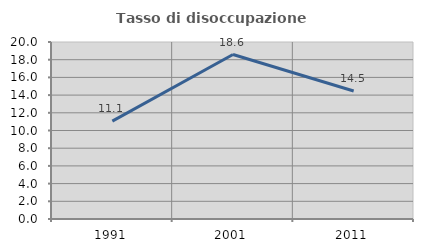
| Category | Tasso di disoccupazione giovanile  |
|---|---|
| 1991.0 | 11.053 |
| 2001.0 | 18.584 |
| 2011.0 | 14.458 |